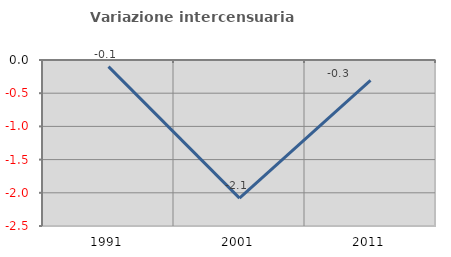
| Category | Variazione intercensuaria annua |
|---|---|
| 1991.0 | -0.1 |
| 2001.0 | -2.079 |
| 2011.0 | -0.307 |